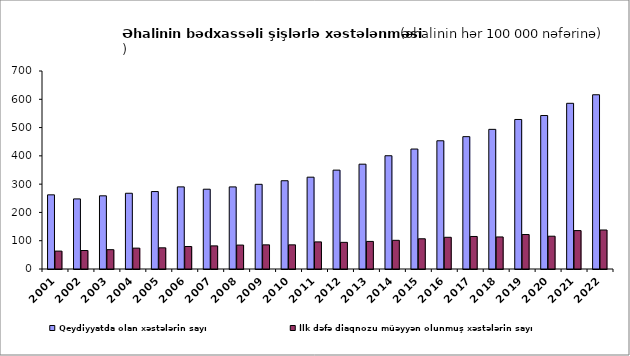
| Category | Qeydiyyatda olan xəstələrin sayı          | İlk dəfə diaqnozu müəyyən olunmuş xəstələrin sayı                            |
|---|---|---|
| 2001.0 | 262.2 | 63.3 |
| 2002.0 | 247.8 | 65.4 |
| 2003.0 | 258.7 | 68.3 |
| 2004.0 | 267.8 | 73.8 |
| 2005.0 | 273.8 | 74.9 |
| 2006.0 | 290.3 | 79.6 |
| 2007.0 | 282.1 | 81.7 |
| 2008.0 | 290.2 | 84.6 |
| 2009.0 | 299.4 | 85.4 |
| 2010.0 | 312 | 85.4 |
| 2011.0 | 324.6 | 95.8 |
| 2012.0 | 349.537 | 94.215 |
| 2013.0 | 370.6 | 97.5 |
| 2014.0 | 400.4 | 101.4 |
| 2015.0 | 424.1 | 106.859 |
| 2016.0 | 453.3 | 112.1 |
| 2017.0 | 467.9 | 115 |
| 2018.0 | 493.7 | 113.3 |
| 2019.0 | 528.6 | 121.9 |
| 2020.0 | 542.6 | 115.9 |
| 2021.0 | 585.8 | 135.8 |
| 2022.0 | 616 | 137.9 |